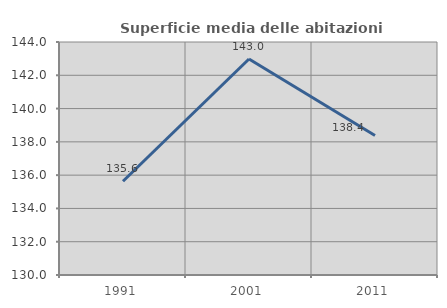
| Category | Superficie media delle abitazioni occupate |
|---|---|
| 1991.0 | 135.634 |
| 2001.0 | 142.979 |
| 2011.0 | 138.384 |